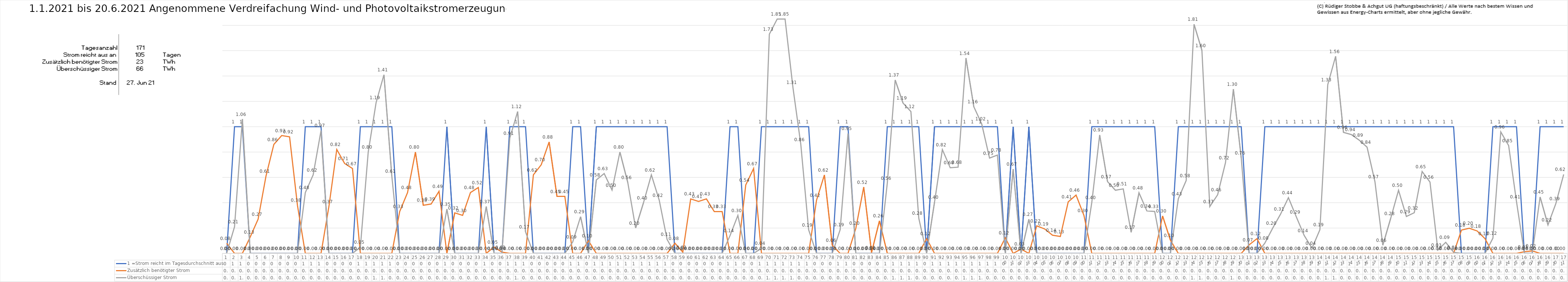
| Category | 1 =Strom reicht im Tagesdurchschnitt aus | Zusätzlich benötigter Strom | Überschüssiger Strom |
|---|---|---|---|
| 0 | 0 | 0.08 | 0 |
| 1 | 1 | 0 | 0.21 |
| 2 | 1 | 0 | 1.06 |
| 3 | 0 | 0.13 | 0 |
| 4 | 0 | 0.27 | 0 |
| 5 | 0 | 0.61 | 0 |
| 6 | 0 | 0.86 | 0 |
| 7 | 0 | 0.93 | 0 |
| 8 | 0 | 0.92 | 0 |
| 9 | 0 | 0.38 | 0 |
| 10 | 1 | 0 | 0.48 |
| 11 | 1 | 0 | 0.62 |
| 12 | 1 | 0 | 0.97 |
| 13 | 0 | 0.37 | 0 |
| 14 | 0 | 0.82 | 0 |
| 15 | 0 | 0.71 | 0 |
| 16 | 0 | 0.67 | 0 |
| 17 | 1 | 0 | 0.05 |
| 18 | 1 | 0 | 0.8 |
| 19 | 1 | 0 | 1.19 |
| 20 | 1 | 0 | 1.41 |
| 21 | 1 | 0 | 0.61 |
| 22 | 0 | 0.33 | 0 |
| 23 | 0 | 0.48 | 0 |
| 24 | 0 | 0.8 | 0 |
| 25 | 0 | 0.38 | 0 |
| 26 | 0 | 0.39 | 0 |
| 27 | 0 | 0.49 | 0 |
| 28 | 1 | 0 | 0.35 |
| 29 | 0 | 0.32 | 0 |
| 30 | 0 | 0.3 | 0 |
| 31 | 0 | 0.48 | 0 |
| 32 | 0 | 0.52 | 0 |
| 33 | 1 | 0 | 0.37 |
| 34 | 0 | 0.05 | 0 |
| 35 | 0 | 0.01 | 0 |
| 36 | 1 | 0 | 0.91 |
| 37 | 1 | 0 | 1.12 |
| 38 | 1 | 0 | 0.17 |
| 39 | 0 | 0.62 | 0 |
| 40 | 0 | 0.7 | 0 |
| 41 | 0 | 0.88 | 0 |
| 42 | 0 | 0.45 | 0 |
| 43 | 0 | 0.45 | 0 |
| 44 | 1 | 0 | 0.09 |
| 45 | 1 | 0 | 0.29 |
| 46 | 0 | 0.1 | 0 |
| 47 | 1 | 0 | 0.58 |
| 48 | 1 | 0 | 0.63 |
| 49 | 1 | 0 | 0.5 |
| 50 | 1 | 0 | 0.8 |
| 51 | 1 | 0 | 0.56 |
| 52 | 1 | 0 | 0.2 |
| 53 | 1 | 0 | 0.4 |
| 54 | 1 | 0 | 0.62 |
| 55 | 1 | 0 | 0.42 |
| 56 | 1 | 0 | 0.11 |
| 57 | 0 | 0.08 | 0 |
| 58 | 0 | 0.01 | 0 |
| 59 | 0 | 0.43 | 0 |
| 60 | 0 | 0.41 | 0 |
| 61 | 0 | 0.43 | 0 |
| 62 | 0 | 0.33 | 0 |
| 63 | 0 | 0.33 | 0 |
| 64 | 1 | 0 | 0.14 |
| 65 | 1 | 0 | 0.3 |
| 66 | 0 | 0.54 | 0 |
| 67 | 0 | 0.67 | 0 |
| 68 | 1 | 0 | 0.04 |
| 69 | 1 | 0 | 1.73 |
| 70 | 1 | 0 | 1.85 |
| 71 | 1 | 0 | 1.85 |
| 72 | 1 | 0 | 1.31 |
| 73 | 1 | 0 | 0.861 |
| 74 | 1 | 0 | 0.185 |
| 75 | 0 | 0.42 | 0 |
| 76 | 0 | 0.619 | 0 |
| 77 | 0 | 0.064 | 0 |
| 78 | 1 | 0 | 0.187 |
| 79 | 1 | 0 | 0.946 |
| 80 | 0 | 0.198 | 0 |
| 81 | 0 | 0.523 | 0 |
| 82 | 0 | 0.007 | 0 |
| 83 | 0 | 0.257 | 0 |
| 84 | 1 | 0 | 0.555 |
| 85 | 1 | 0 | 1.369 |
| 86 | 1 | 0 | 1.186 |
| 87 | 1 | 0 | 1.12 |
| 88 | 1 | 0 | 0.278 |
| 89 | 0 | 0.117 | 0 |
| 90 | 1 | 0 | 0.403 |
| 91 | 1 | 0 | 0.819 |
| 92 | 1 | 0 | 0.676 |
| 93 | 1 | 0 | 0.681 |
| 94 | 1 | 0 | 1.541 |
| 95 | 1 | 0 | 1.158 |
| 96 | 1 | 0 | 1.022 |
| 97 | 1 | 0 | 0.752 |
| 98 | 1 | 0 | 0.776 |
| 99 | 0 | 0.123 | 0 |
| 100 | 1 | 0 | 0.665 |
| 101 | 0 | 0.034 | 0 |
| 102 | 1 | 0 | 0.269 |
| 103 | 0 | 0.218 | 0 |
| 104 | 0 | 0.193 | 0 |
| 105 | 0 | 0.144 | 0 |
| 106 | 0 | 0.133 | 0 |
| 107 | 0 | 0.407 | 0 |
| 108 | 0 | 0.46 | 0 |
| 109 | 0 | 0.3 | 0 |
| 110 | 1 | 0 | 0.402 |
| 111 | 1 | 0 | 0.934 |
| 112 | 1 | 0 | 0.567 |
| 113 | 1 | 0 | 0.498 |
| 114 | 1 | 0 | 0.509 |
| 115 | 1 | 0 | 0.167 |
| 116 | 1 | 0 | 0.478 |
| 117 | 1 | 0 | 0.336 |
| 118 | 1 | 0 | 0.331 |
| 119 | 0 | 0.296 | 0 |
| 120 | 0 | 0.103 | 0 |
| 121 | 1 | 0 | 0.432 |
| 122 | 1 | 0 | 0.575 |
| 123 | 1 | 0 | 1.808 |
| 124 | 1 | 0 | 1.602 |
| 125 | 1 | 0 | 0.369 |
| 126 | 1 | 0 | 0.463 |
| 127 | 1 | 0 | 0.716 |
| 128 | 1 | 0 | 1.296 |
| 129 | 1 | 0 | 0.755 |
| 130 | 0 | 0.067 | 0 |
| 131 | 0 | 0.117 | 0 |
| 132 | 1 | 0 | 0.081 |
| 133 | 1 | 0 | 0.2 |
| 134 | 1 | 0 | 0.31 |
| 135 | 1 | 0 | 0.44 |
| 136 | 1 | 0 | 0.289 |
| 137 | 1 | 0 | 0.142 |
| 138 | 1 | 0 | 0.041 |
| 139 | 1 | 0 | 0.186 |
| 140 | 1 | 0 | 1.332 |
| 141 | 1 | 0 | 1.555 |
| 142 | 1 | 0 | 0.955 |
| 143 | 1 | 0 | 0.938 |
| 144 | 1 | 0 | 0.894 |
| 145 | 1 | 0 | 0.838 |
| 146 | 1 | 0 | 0.567 |
| 147 | 1 | 0 | 0.064 |
| 148 | 1 | 0 | 0.276 |
| 149 | 1 | 0 | 0.498 |
| 150 | 1 | 0 | 0.292 |
| 151 | 1 | 0 | 0.321 |
| 152 | 1 | 0 | 0.646 |
| 153 | 1 | 0 | 0.563 |
| 154 | 1 | 0 | 0.026 |
| 155 | 1 | 0 | 0.087 |
| 156 | 1 | 0 | 0.009 |
| 157 | 0 | 0.184 | 0 |
| 158 | 0 | 0.199 | 0 |
| 159 | 0 | 0.177 | 0 |
| 160 | 0 | 0.116 | 0 |
| 161 | 1 | 0 | 0.12 |
| 162 | 1 | 0 | 0.959 |
| 163 | 1 | 0 | 0.851 |
| 164 | 1 | 0 | 0.408 |
| 165 | 0 | 0.013 | 0 |
| 166 | 0 | 0.019 | 0 |
| 167 | 1 | 0 | 0.445 |
| 168 | 1 | 0 | 0.225 |
| 169 | 1 | 0 | 0.393 |
| 170 | 1 | 0 | 0.623 |